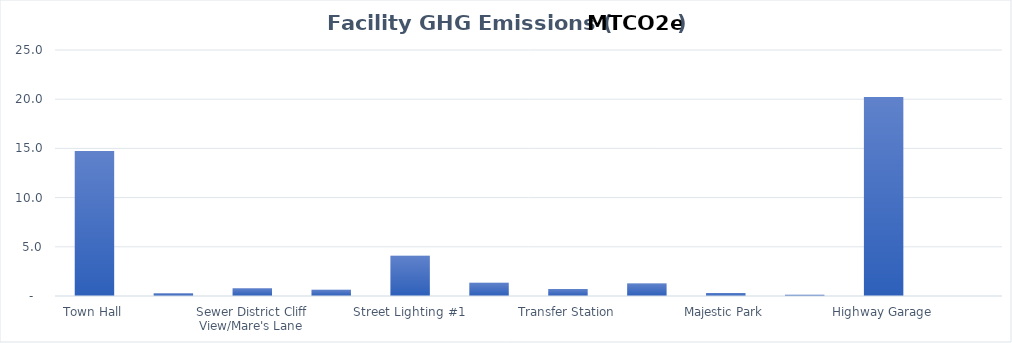
| Category | GHG Emissions (tons) |
|---|---|
| Town Hall | 14.739 |
| Sewer District Dusinberre Road | 0.282 |
| Sewer District Cliff View/Mare's Lane | 0.778 |
| Sewer Plant Farmer's Turnpike | 0.642 |
| Street Lighting #1 | 4.09 |
| Street Lighting #2 | 1.347 |
| Transfer Station | 0.707 |
| Kennel | 1.261 |
| Majestic Park | 0.307 |
| Majestic Park Rec Center | 0.119 |
| Highway Garage | 20.227 |